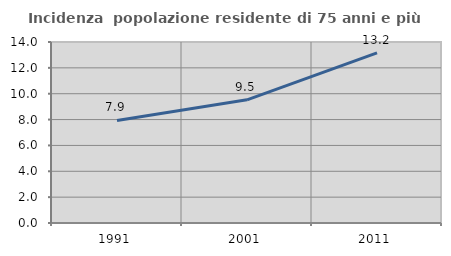
| Category | Incidenza  popolazione residente di 75 anni e più |
|---|---|
| 1991.0 | 7.934 |
| 2001.0 | 9.526 |
| 2011.0 | 13.153 |